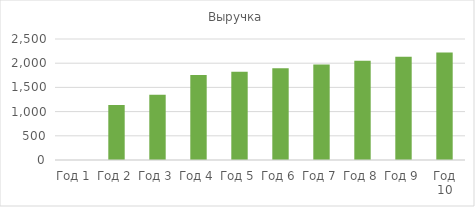
| Category | Выручка |
|---|---|
| Год 1 | 0 |
| Год 2 | 1135.68 |
| Год 3 | 1349.837 |
| Год 4 | 1754.788 |
| Год 5 | 1824.979 |
| Год 6 | 1897.979 |
| Год 7 | 1973.898 |
| Год 8 | 2052.854 |
| Год 9 | 2134.968 |
| Год 10 | 2220.366 |